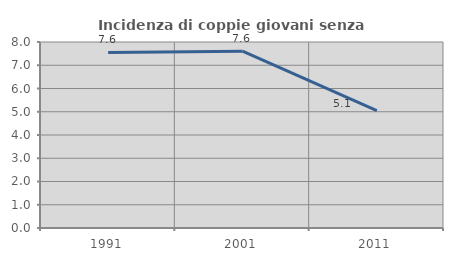
| Category | Incidenza di coppie giovani senza figli |
|---|---|
| 1991.0 | 7.552 |
| 2001.0 | 7.602 |
| 2011.0 | 5.052 |